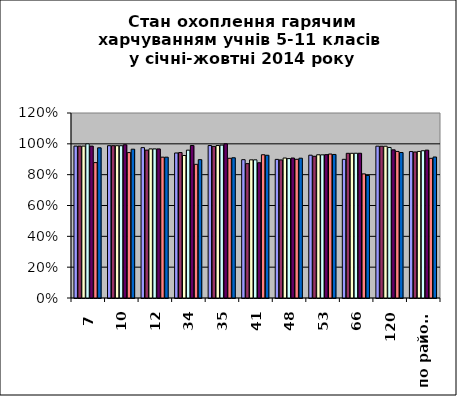
| Category | Series 0 | Series 1 | Series 2 | Series 3 | Series 4 | Series 5 | Series 6 |
|---|---|---|---|---|---|---|---|
| 7 | 0.985 | 0.985 | 0.985 | 1 | 0.985 | 0.878 | 0.974 |
| 10 | 0.988 | 0.988 | 0.988 | 0.988 | 0.994 | 0.943 | 0.965 |
| 12 | 0.975 | 0.959 | 0.967 | 0.967 | 0.967 | 0.913 | 0.913 |
| 34 | 0.941 | 0.943 | 0.924 | 0.959 | 0.989 | 0.867 | 0.897 |
| 35 | 0.989 | 0.984 | 0.989 | 0.992 | 1 | 0.906 | 0.91 |
| 41 | 0.897 | 0.872 | 0.896 | 0.896 | 0.877 | 0.929 | 0.926 |
| 48 | 0.899 | 0.896 | 0.908 | 0.904 | 0.908 | 0.9 | 0.907 |
| 53 | 0.926 | 0.919 | 0.929 | 0.929 | 0.93 | 0.934 | 0.931 |
| 66 | 0.9 | 0.939 | 0.939 | 0.939 | 0.939 | 0.805 | 0.795 |
| 120 | 0.985 | 0.984 | 0.984 | 0.976 | 0.961 | 0.951 | 0.944 |
| по району | 0.95 | 0.947 | 0.951 | 0.955 | 0.959 | 0.906 | 0.915 |